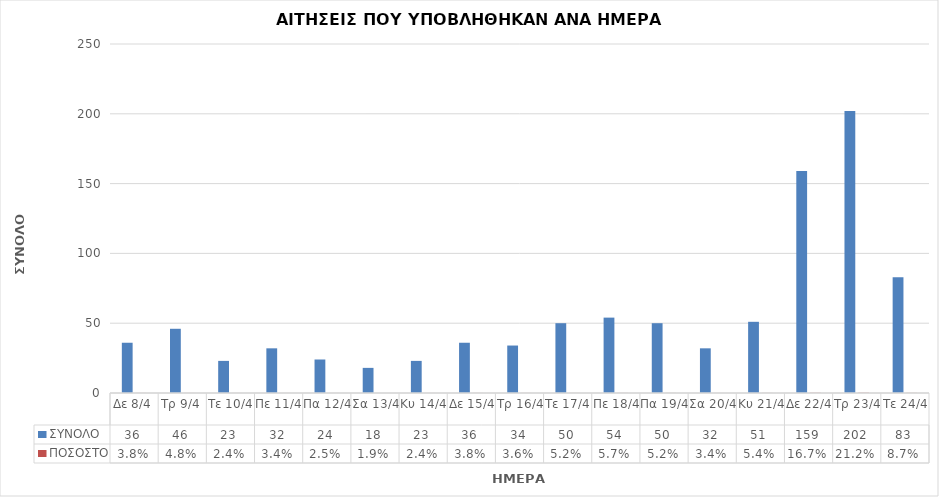
| Category | ΣΥΝΟΛΟ | ΠΟΣΟΣΤΟ |
|---|---|---|
| Δε 8/4 | 36 | 0.038 |
| Τρ 9/4 | 46 | 0.048 |
| Τε 10/4 | 23 | 0.024 |
| Πε 11/4 | 32 | 0.034 |
| Πα 12/4 | 24 | 0.025 |
| Σα 13/4 | 18 | 0.019 |
| Κυ 14/4 | 23 | 0.024 |
| Δε 15/4 | 36 | 0.038 |
| Τρ 16/4 | 34 | 0.036 |
| Τε 17/4 | 50 | 0.052 |
| Πε 18/4 | 54 | 0.057 |
| Πα 19/4 | 50 | 0.052 |
| Σα 20/4 | 32 | 0.034 |
| Κυ 21/4 | 51 | 0.054 |
| Δε 22/4 | 159 | 0.167 |
| Τρ 23/4 | 202 | 0.212 |
| Τε 24/4 | 83 | 0.087 |